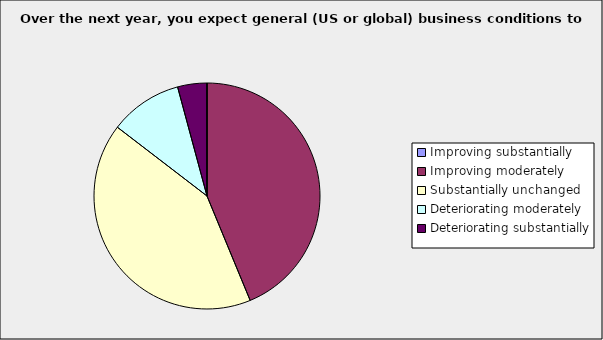
| Category | Series 0 |
|---|---|
| Improving substantially | 0 |
| Improving moderately | 0.438 |
| Substantially unchanged | 0.417 |
| Deteriorating moderately | 0.104 |
| Deteriorating substantially | 0.042 |